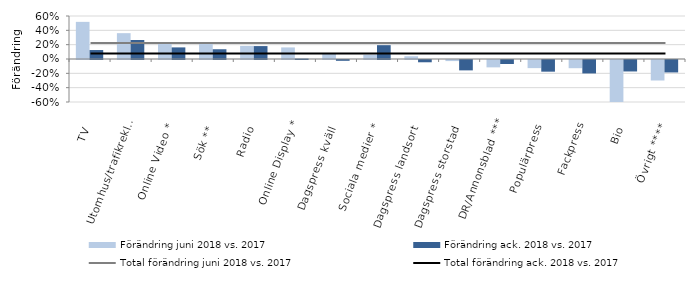
| Category | Förändring juni 2018 vs. 2017 | Förändring ack. 2018 vs. 2017 |
|---|---|---|
| TV | 0.518 | 0.125 |
| Utomhus/trafikreklam | 0.36 | 0.265 |
| Online Video * | 0.229 | 0.162 |
| Sök ** | 0.22 | 0.136 |
| Radio | 0.183 | 0.18 |
| Online Display * | 0.162 | 0.006 |
| Dagspress kväll  | 0.08 | -0.011 |
| Sociala medier * | 0.06 | 0.193 |
| Dagspress landsort  | 0.038 | -0.032 |
| Dagspress storstad  | -0.015 | -0.145 |
| DR/Annonsblad *** | -0.103 | -0.056 |
| Populärpress | -0.113 | -0.163 |
| Fackpress | -0.114 | -0.187 |
| Bio | -0.591 | -0.16 |
| Övrigt **** | -0.286 | -0.174 |